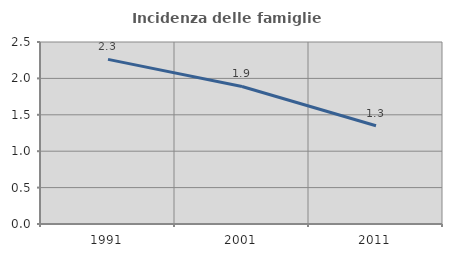
| Category | Incidenza delle famiglie numerose |
|---|---|
| 1991.0 | 2.261 |
| 2001.0 | 1.889 |
| 2011.0 | 1.349 |